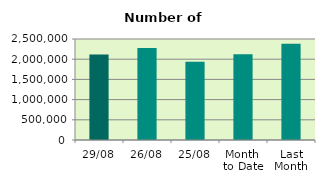
| Category | Series 0 |
|---|---|
| 29/08 | 2116296 |
| 26/08 | 2274436 |
| 25/08 | 1937290 |
| Month 
to Date | 2121673.333 |
| Last
Month | 2380266.19 |